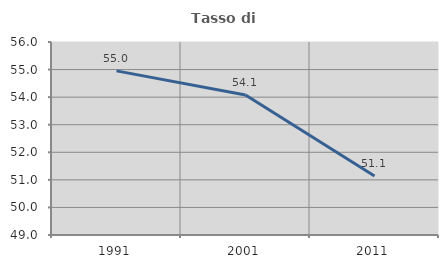
| Category | Tasso di occupazione   |
|---|---|
| 1991.0 | 54.952 |
| 2001.0 | 54.075 |
| 2011.0 | 51.143 |